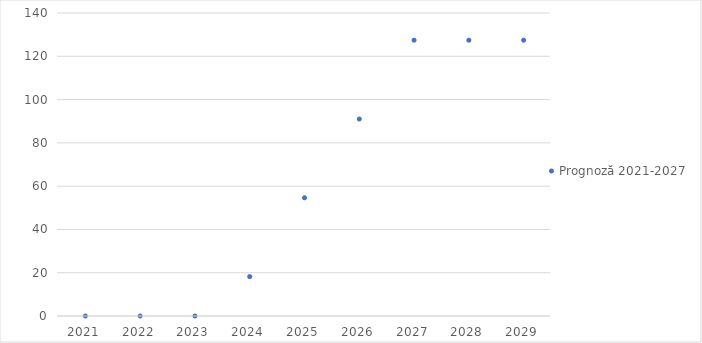
| Category | Prognoză 2021-2027 |
|---|---|
| 2021.0 | 0 |
| 2022.0 | 0 |
| 2023.0 | 0 |
| 2024.0 | 18.205 |
| 2025.0 | 54.615 |
| 2026.0 | 91.025 |
| 2027.0 | 127.435 |
| 2028.0 | 127.435 |
| 2029.0 | 127.435 |